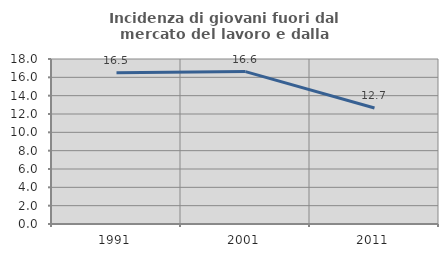
| Category | Incidenza di giovani fuori dal mercato del lavoro e dalla formazione  |
|---|---|
| 1991.0 | 16.512 |
| 2001.0 | 16.624 |
| 2011.0 | 12.655 |